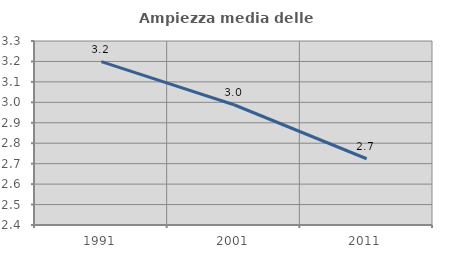
| Category | Ampiezza media delle famiglie |
|---|---|
| 1991.0 | 3.199 |
| 2001.0 | 2.988 |
| 2011.0 | 2.724 |